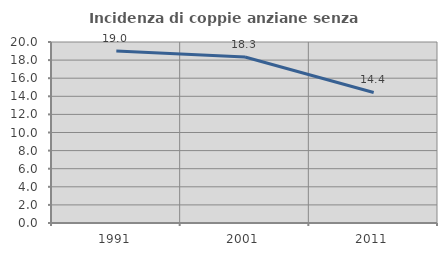
| Category | Incidenza di coppie anziane senza figli  |
|---|---|
| 1991.0 | 19.006 |
| 2001.0 | 18.341 |
| 2011.0 | 14.422 |